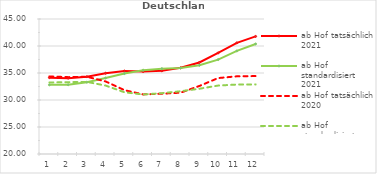
| Category | ab Hof tatsächlich 2021 | ab Hof standardisiert 2021 | ab Hof tatsächlich 2020 | ab Hof standardisiert 2020 |
|---|---|---|---|---|
| 0 | 34.142 | 32.806 | 34.37 | 33.236 |
| 1 | 34.048 | 32.821 | 34.232 | 33.305 |
| 2 | 34.318 | 33.303 | 34.307 | 33.349 |
| 3 | 34.958 | 34.074 | 33.437 | 32.673 |
| 4 | 35.359 | 34.893 | 31.829 | 31.435 |
| 5 | 35.284 | 35.525 | 31.034 | 31.021 |
| 6 | 35.404 | 35.805 | 31.165 | 31.262 |
| 7 | 35.959 | 35.927 | 31.359 | 31.622 |
| 8 | 36.953 | 36.421 | 32.599 | 32.083 |
| 9 | 38.716 | 37.483 | 34.06 | 32.674 |
| 10 | 40.586 | 39.088 | 34.386 | 32.861 |
| 11 | 41.776 | 40.381 | 34.43 | 32.881 |